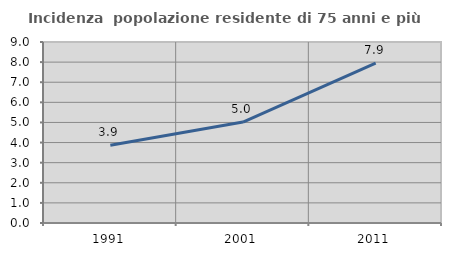
| Category | Incidenza  popolazione residente di 75 anni e più |
|---|---|
| 1991.0 | 3.862 |
| 2001.0 | 5.019 |
| 2011.0 | 7.948 |